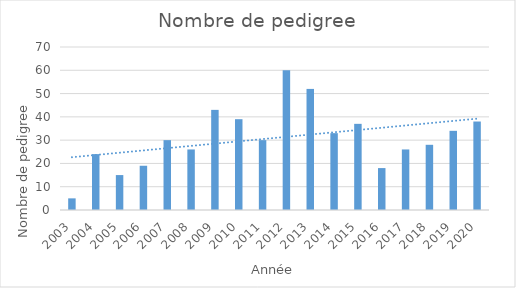
| Category | Series 0 |
|---|---|
| 2003.0 | 5 |
| 2004.0 | 24 |
| 2005.0 | 15 |
| 2006.0 | 19 |
| 2007.0 | 30 |
| 2008.0 | 26 |
| 2009.0 | 43 |
| 2010.0 | 39 |
| 2011.0 | 30 |
| 2012.0 | 60 |
| 2013.0 | 52 |
| 2014.0 | 33 |
| 2015.0 | 37 |
| 2016.0 | 18 |
| 2017.0 | 26 |
| 2018.0 | 28 |
| 2019.0 | 34 |
| 2020.0 | 38 |